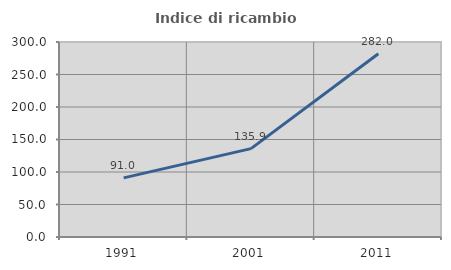
| Category | Indice di ricambio occupazionale  |
|---|---|
| 1991.0 | 91.002 |
| 2001.0 | 135.917 |
| 2011.0 | 281.958 |